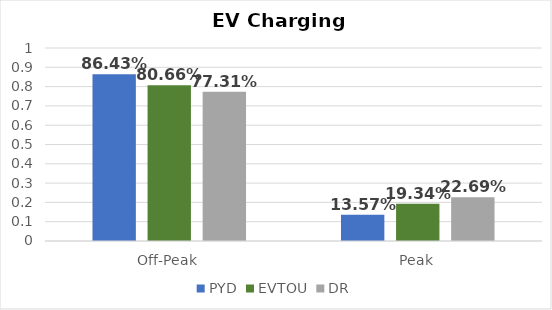
| Category | PYD | EVTOU | DR |
|---|---|---|---|
| Off-Peak | 0.864 | 0.807 | 0.773 |
| Peak | 0.136 | 0.193 | 0.227 |